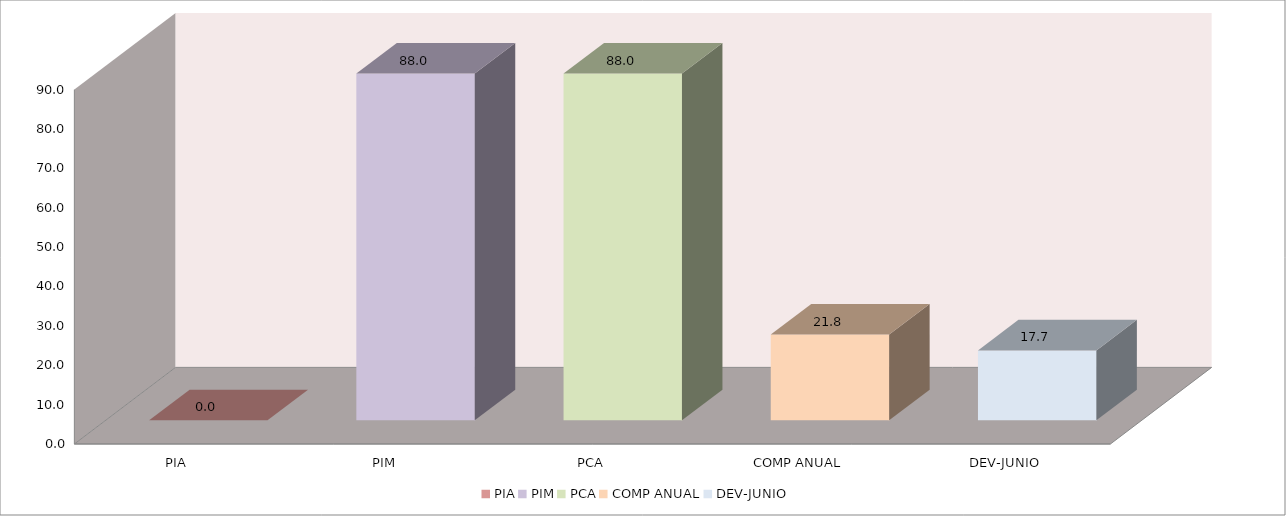
| Category | 011 MINISTERIO DE SALUD |
|---|---|
| PIA | 0 |
| PIM | 88.05 |
| PCA | 88.05 |
| COMP ANUAL | 21.782 |
| DEV-JUNIO | 17.743 |